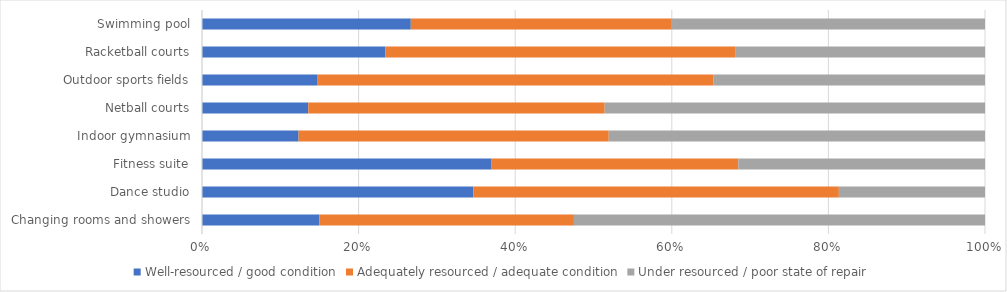
| Category | Well-resourced / good condition | Adequately resourced / adequate condition | Under resourced / poor state of repair |
|---|---|---|---|
| Changing rooms and showers | 0.15 | 0.325 | 0.525 |
| Dance studio | 0.347 | 0.467 | 0.187 |
| Fitness suite | 0.37 | 0.315 | 0.315 |
| Indoor gymnasium | 0.123 | 0.396 | 0.481 |
| Netball courts | 0.136 | 0.379 | 0.486 |
| Outdoor sports fields | 0.148 | 0.506 | 0.347 |
| Racketball courts | 0.234 | 0.447 | 0.319 |
| Swimming pool | 0.267 | 0.333 | 0.4 |